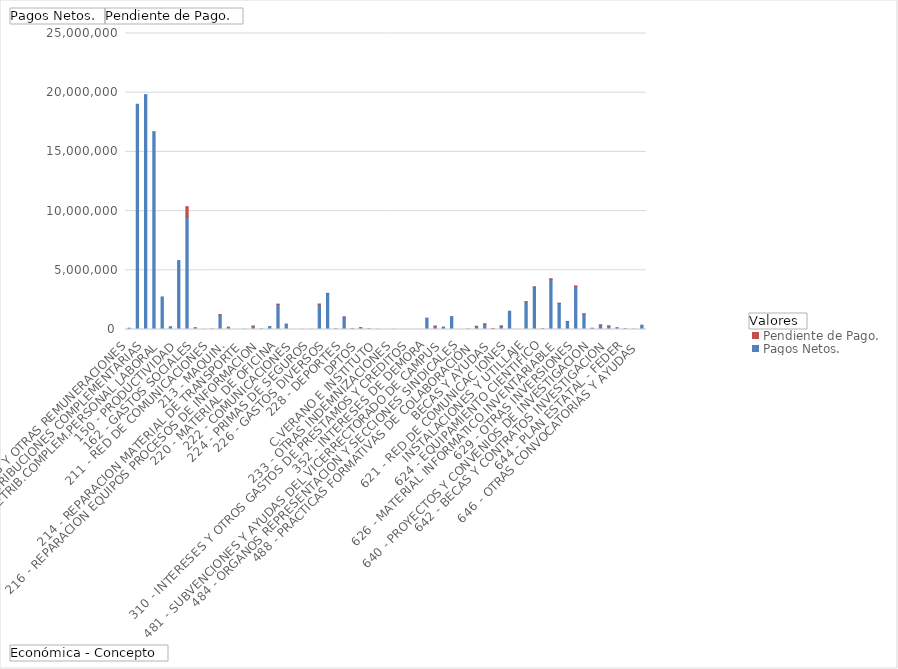
| Category | Pagos Netos. | Pendiente de Pago. |
|---|---|---|
| 110 - RETRIB.BASICAS Y OTRAS REMUNERACIONES | 108743.37 | 0 |
| 120 - RETRIBUCIONES BASICAS | 19033531.21 | 0 |
| 121 - RETRIBUCIONES COMPLEMENTARIAS | 19834213.49 | 0 |
| 130 - RETRIB.BASICAS PERSONAL LABORAL | 16710402.42 | 0 |
| 131 - RETRIB.COMPLEM.PERSONAL LABORAL | 2749558.66 | 0 |
| 132 - OTRO PERSONAL LABORAL | 233613.75 | 0 |
| 150 - PRODUCTIVIDAD | 5821059.81 | 0 |
| 160 - CUOTAS SOCIALES | 9507601.2 | 868889.05 |
| 162 - GASTOS SOCIALES | 156557.06 | 0 |
| 202 - ARRENDAMIENTO EDIFICIOS Y OTRAS CONSTRUCCIONES | 14842.96 | 0 |
| 211 - RED DE COMUNICACIONES | 41572.66 | 0 |
| 212 - REPARACION EDIFICIOS Y OTRAS CONSTRUCC. | 1238360.18 | 12012.32 |
| 213 - MAQUIN., INSTALAC. Y UTILLAJE | 204680.78 | 0 |
| 214 - REPARACION MATERIAL DE TRANSPORTE | 2166.56 | 0 |
| 215 - REPARACION MOBILIARIO Y ENSERES | 26088.73 | 0 |
| 216 - REPARACION EQUIPOS PROCESOS DE INFORMACION | 270935.84 | 16607.52 |
| 217 - SERVICIOS DE REPROGRAFIA | 46474.81 | 0 |
| 220 - MATERIAL DE OFICINA | 251055.92 | 0 |
| 221 - SUMINISTROS | 2125935.85 | 7615.77 |
| 222 - COMUNICACIONES | 462538.53 | 0 |
| 223 - TRANSPORTES | 3670.81 | 0 |
| 224 - PRIMAS DE SEGUROS | 17059.69 | 0 |
| 225 - TRIBUTOS | 19931.44 | 0 |
| 226 - GASTOS DIVERSOS | 2124129.35 | 22948.88 |
| 227 - TRABAJOS REALIZADOS POR OTRAS EMPRESAS | 3045204.04 | 5742.15 |
| 228 - DEPORTES | 52941.38 | 0 |
| 229 - GASTOS DESCENT. A CENTROS, DPTOS, CIUC, C.VERANO E INSTITUTO | 1049501.53 | 4548.55 |
| 230 - DIETAS Y LOCOMOCION | 39552.94 | 300 |
| 233 - OTRAS INDEMNIZACIONES | 172523.31 | 0 |
| 240 - GASTOS DE EDICION Y DISTRIBUCION DE PUBLICACIONES | 65623.71 | 0 |
| 310 - INTERESES Y OTROS GASTOS DE PRESTAMOS Y CREDITOS | 25691.07 | 0 |
| 341 - INTERESES DE FIANZAS Y AVALES | 478.42 | 0 |
| 352 - INTERESES DE DEMORA | 16951.76 | 0 |
| 359 - OTROS GASTOS FINANCIEROS | 3713.53 | 0 |
| 481 - SUBVENCIONES Y AYUDAS DEL VICERRECTORADO DE CAMPUS, SERVICIOS Y SOSTENIBILIDAD | 250 | 0 |
| 484 - ORGANOS REPRESENTACION Y SECCIONES SINDICALES | 4335.12 | 0 |
| 487 - BECAS Y AYUDAS PROGRAMAS DE INTERCAMBIO Y OTROS | 962172.49 | 0 |
| 488 - PRÁCTICAS FORMATIVAS DE COLABORACIÓN | 277316.38 | 2482.91 |
| 489 - OTRAS SUBVENCIONES, BECAS Y AYUDAS | 206432.65 | 0 |
| 620 - EDIFICIOS Y OTRAS CONSTRUCCIONES | 1091899.4 | 0 |
| 621 - RED DE COMUNICAC IONES | 0 | 0 |
| 622 - MAQUINARIA, INSTALACIONES Y UTILLAJE | 19669.75 | 6319.74 |
| 623 - EQUIPAMIENTO DOCENTE | 260147.72 | 8980.62 |
| 624 - EQUIPAMIENTO CIENTIFICO | 459625.32 | 12740 |
| 625 - MOBILIARIO Y ENSERES | 64895.95 | 11002.95 |
| 626 - MATERIAL INFORMATICO INVENTARIABLE | 292320.86 | 2959.68 |
| 628 - FONDOS DE BIBLIOTECA | 1542052.58 | 0 |
| 629 - OTRAS INVERSIONES | 11082.53 | 0 |
| 630 - EDIFICIOS Y OTRAS CONSTRUCCIONES | 2333174.72 | 6796.6 |
| 640 - PROYECTOS Y CONVENIOS DE INVESTIGACION | 3575384.53 | 26554.99 |
| 641 - BOLSAS Y AYUDAS INVESTIGACION | 69217.55 | 0 |
| 642 - BECAS Y CONTRATOS INVESTIGACION | 4207139.21 | 80193.51 |
| 643 - PLAN ESTATAL - PGE | 2203011.43 | 21984.36 |
| 644 - PLAN ESTATAL - FEDER | 667413.57 | 6214.3 |
| 645 - PROYECTOS EUROPEOS | 3639910.49 | 36946.98 |
| 646 - OTRAS CONVOCATORIAS Y AYUDAS | 1309789.22 | 17134.16 |
| 647 - CATEDRAS | 97498.98 | 951.88 |
| 648 - AYUDAS A LA INVESTIGACION | 378120.38 | 10854.14 |
| 649 - OTROS FONDOS DE INVESTIGACIÓN | 296946.49 | 3104.49 |
| 781 - TRANSF.CAPITAL A FUNDACION LEONARDO TORRES QUEVEDO | 156802.94 | 0 |
| 783 - CSIC | 65000 | 0 |
| 830 - PRESTAMOS A CORTO PLAZO AL PERSONAL | 29964 | 0 |
| 911 - AMORTIZACION ANTICIPOS REEMBOLSABLES A LARGO PLAZO ENTES E.P | 369494.35 | 0 |